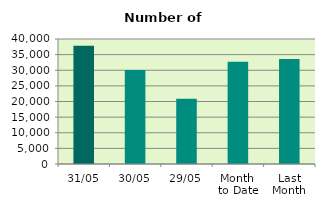
| Category | Series 0 |
|---|---|
| 31/05 | 37810 |
| 30/05 | 30084 |
| 29/05 | 20904 |
| Month 
to Date | 32723.818 |
| Last
Month | 33588.111 |